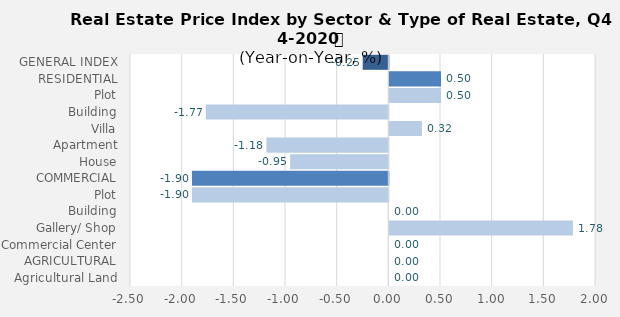
| Category | Q4- 2019 |
|---|---|
| GENERAL INDEX | -0.248 |
| RESIDENTIAL | 0.5 |
| Plot | 0.5 |
| Building | -1.766 |
| Villa | 0.316 |
| Apartment | -1.18 |
| House | -0.95 |
| COMMERCIAL | -1.9 |
| Plot | -1.9 |
| Building | 0 |
| Gallery/ Shop | 1.777 |
| Commercial Center | 0 |
| AGRICULTURAL | 0 |
| Agricultural Land | 0 |